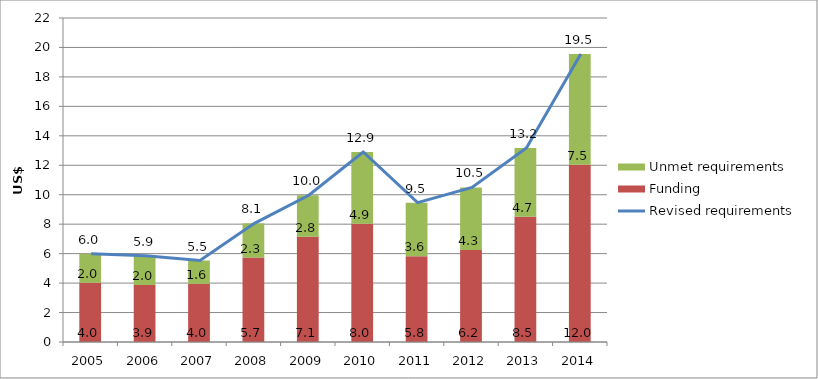
| Category | Funding  | Unmet requirements |
|---|---|---|
| 2005.0 | 4.021 | 1.971 |
| 2006.0 | 3.868 | 1.995 |
| 2007.0 | 3.953 | 1.58 |
| 2008.0 | 5.732 | 2.327 |
| 2009.0 | 7.143 | 2.822 |
| 2010.0 | 8.028 | 4.872 |
| 2011.0 | 5.83 | 3.629 |
| 2012.0 | 6.24 | 4.255 |
| 2013.0 | 8.508 | 4.669 |
| 2014.0 | 12.032 | 7.517 |